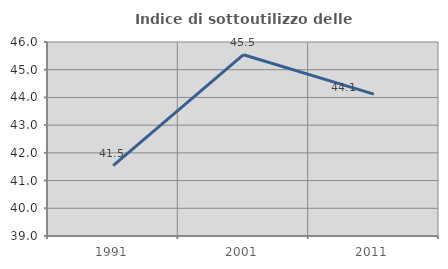
| Category | Indice di sottoutilizzo delle abitazioni  |
|---|---|
| 1991.0 | 41.536 |
| 2001.0 | 45.542 |
| 2011.0 | 44.12 |